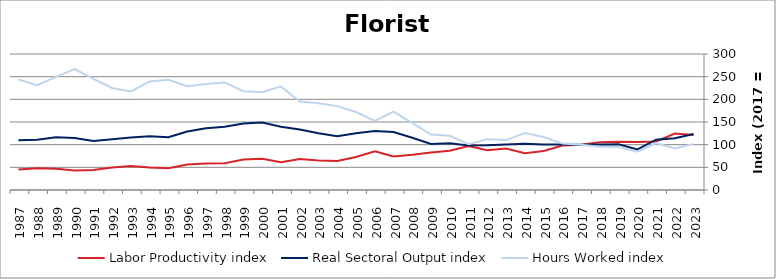
| Category | Labor Productivity index | Real Sectoral Output index | Hours Worked index |
|---|---|---|---|
| 2023.0 | 121.573 | 123.745 | 101.787 |
| 2022.0 | 124.524 | 114.207 | 91.715 |
| 2021.0 | 107.084 | 110.903 | 103.567 |
| 2020.0 | 105.864 | 89.569 | 84.608 |
| 2019.0 | 106.63 | 100.907 | 94.633 |
| 2018.0 | 105.404 | 100.522 | 95.368 |
| 2017.0 | 100 | 100 | 100 |
| 2016.0 | 97.935 | 100.334 | 102.449 |
| 2015.0 | 85.997 | 100.417 | 116.768 |
| 2014.0 | 81.211 | 102.174 | 125.814 |
| 2013.0 | 91.273 | 100.44 | 110.043 |
| 2012.0 | 87.951 | 98.638 | 112.152 |
| 2011.0 | 97.087 | 97.997 | 100.937 |
| 2010.0 | 86.484 | 103.357 | 119.51 |
| 2009.0 | 82.904 | 101.52 | 122.454 |
| 2008.0 | 77.907 | 115.246 | 147.928 |
| 2007.0 | 73.927 | 127.937 | 173.058 |
| 2006.0 | 85.162 | 129.971 | 152.617 |
| 2005.0 | 72.873 | 125.4 | 172.08 |
| 2004.0 | 64.111 | 118.609 | 185.005 |
| 2003.0 | 65.238 | 124.989 | 191.591 |
| 2002.0 | 68.277 | 133.303 | 195.239 |
| 2001.0 | 61.048 | 139.582 | 228.644 |
| 2000.0 | 69.008 | 148.858 | 215.71 |
| 1999.0 | 67.406 | 146.91 | 217.948 |
| 1998.0 | 58.888 | 139.706 | 237.24 |
| 1997.0 | 58.267 | 136.27 | 233.872 |
| 1996.0 | 56.278 | 128.904 | 229.049 |
| 1995.0 | 47.981 | 116.602 | 243.018 |
| 1994.0 | 49.485 | 118.526 | 239.518 |
| 1993.0 | 53.107 | 115.551 | 217.581 |
| 1992.0 | 49.832 | 112.127 | 225.01 |
| 1991.0 | 44.175 | 108.247 | 245.043 |
| 1990.0 | 42.936 | 114.519 | 266.722 |
| 1989.0 | 46.75 | 116.605 | 249.421 |
| 1988.0 | 48.03 | 111.115 | 231.342 |
| 1987.0 | 45.052 | 109.964 | 244.083 |